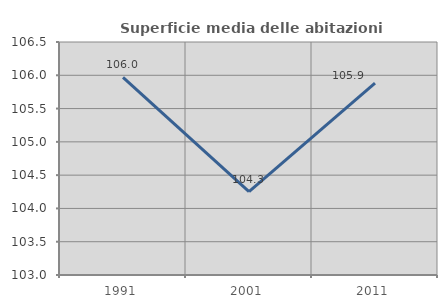
| Category | Superficie media delle abitazioni occupate |
|---|---|
| 1991.0 | 105.967 |
| 2001.0 | 104.251 |
| 2011.0 | 105.881 |